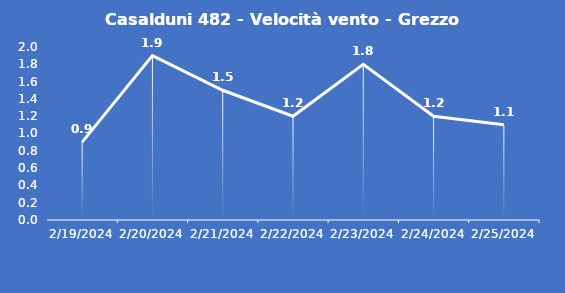
| Category | Casalduni 482 - Velocità vento - Grezzo (m/s) |
|---|---|
| 2/19/24 | 0.9 |
| 2/20/24 | 1.9 |
| 2/21/24 | 1.5 |
| 2/22/24 | 1.2 |
| 2/23/24 | 1.8 |
| 2/24/24 | 1.2 |
| 2/25/24 | 1.1 |